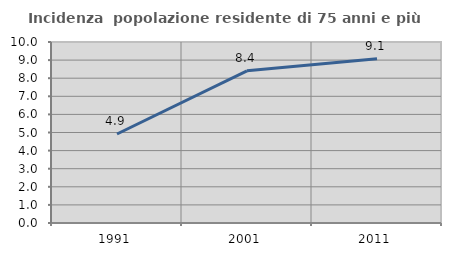
| Category | Incidenza  popolazione residente di 75 anni e più |
|---|---|
| 1991.0 | 4.918 |
| 2001.0 | 8.408 |
| 2011.0 | 9.072 |